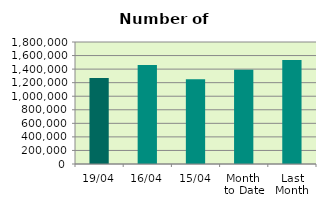
| Category | Series 0 |
|---|---|
| 19/04 | 1269680 |
| 16/04 | 1460802 |
| 15/04 | 1250772 |
| Month 
to Date | 1390227.818 |
| Last
Month | 1535393.739 |